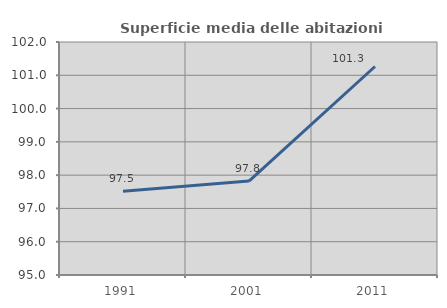
| Category | Superficie media delle abitazioni occupate |
|---|---|
| 1991.0 | 97.52 |
| 2001.0 | 97.821 |
| 2011.0 | 101.264 |